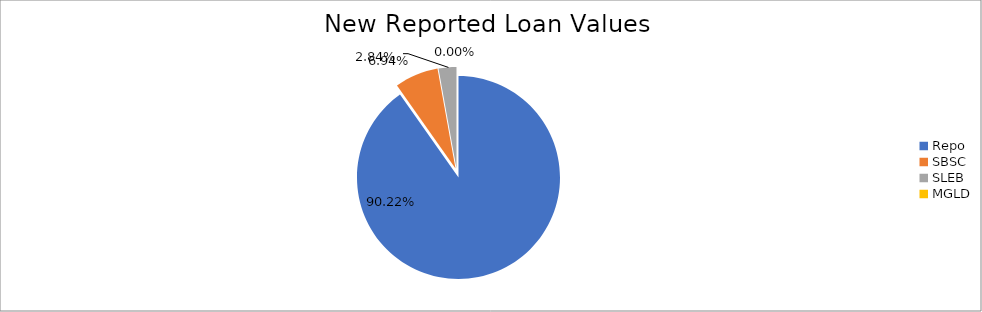
| Category | Series 0 |
|---|---|
| Repo | 11830978.45 |
| SBSC | 910234.097 |
| SLEB | 371962.451 |
| MGLD | 178.456 |